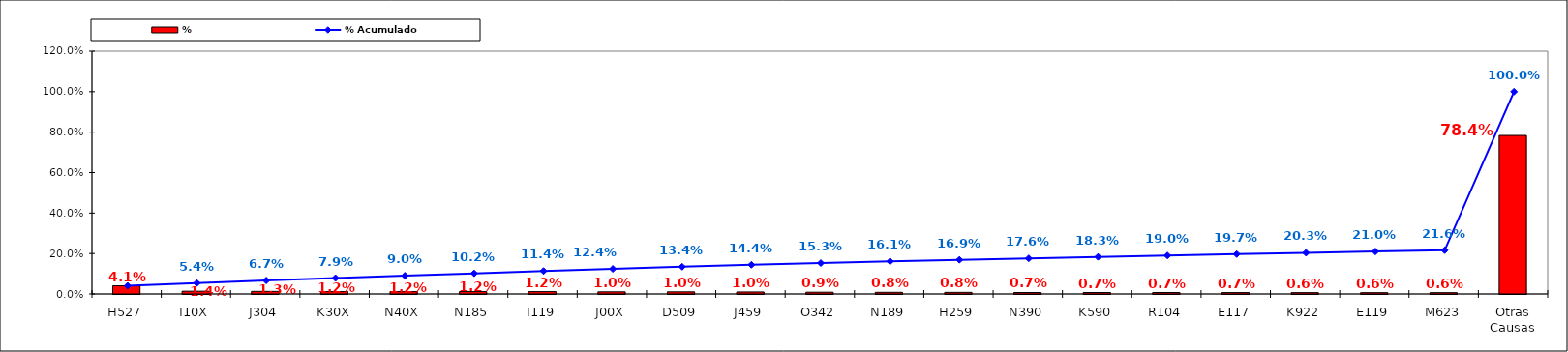
| Category | % |
|---|---|
| H527 | 0.041 |
| I10X | 0.014 |
| J304 | 0.013 |
| K30X | 0.012 |
| N40X | 0.012 |
| N185 | 0.012 |
| I119 | 0.012 |
| J00X | 0.01 |
| D509 | 0.01 |
| J459 | 0.01 |
| O342 | 0.009 |
| N189 | 0.008 |
| H259 | 0.008 |
| N390 | 0.007 |
| K590 | 0.007 |
| R104 | 0.007 |
| E117 | 0.007 |
| K922 | 0.006 |
| E119 | 0.006 |
| M623 | 0.006 |
| Otras Causas | 0.784 |